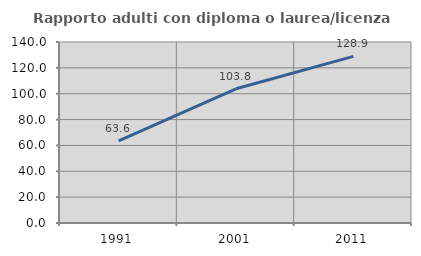
| Category | Rapporto adulti con diploma o laurea/licenza media  |
|---|---|
| 1991.0 | 63.559 |
| 2001.0 | 103.803 |
| 2011.0 | 128.88 |